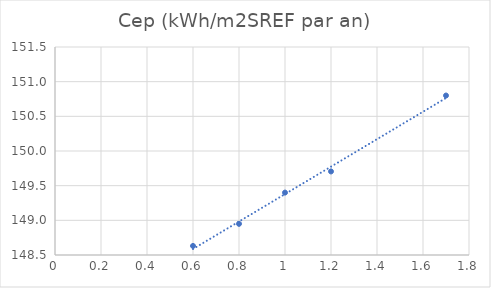
| Category | Cep (kWh/m2SREF par an) |
|---|---|
| 1.7 | 150.8 |
| 1.2 | 149.705 |
| 1.0 | 149.4 |
| 0.8 | 148.949 |
| 0.6 | 148.631 |